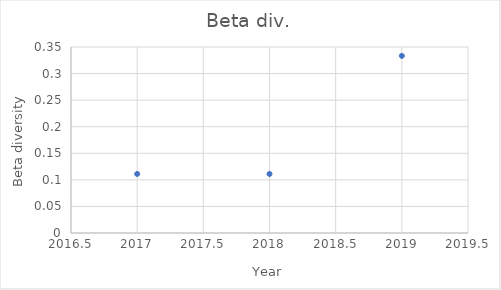
| Category | Beta div. |
|---|---|
| 2017.0 | 0.111 |
| 2018.0 | 0.111 |
| 2019.0 | 0.333 |